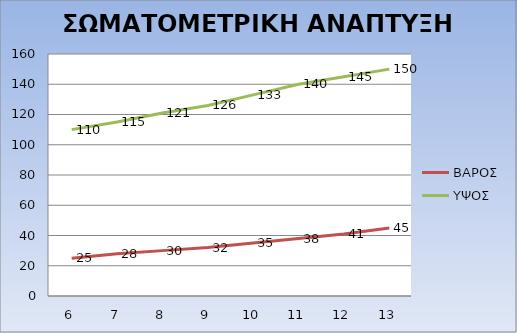
| Category | ΒΑΡΟΣ | ΥΨΟΣ | ΕΤΟΣ |
|---|---|---|---|
| 6.0 | 25 | 110 |  |
| 7.0 | 28 | 115 |  |
| 8.0 | 30 | 121 |  |
| 9.0 | 32 | 126 |  |
| 10.0 | 35 | 133 |  |
| 11.0 | 38 | 140 |  |
| 12.0 | 41 | 145 |  |
| 13.0 | 45 | 150 |  |